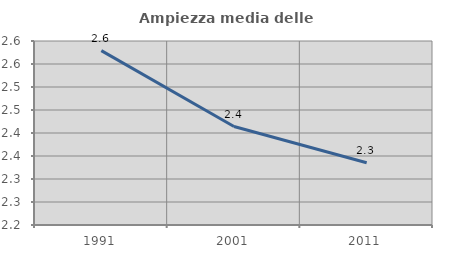
| Category | Ampiezza media delle famiglie |
|---|---|
| 1991.0 | 2.579 |
| 2001.0 | 2.414 |
| 2011.0 | 2.335 |